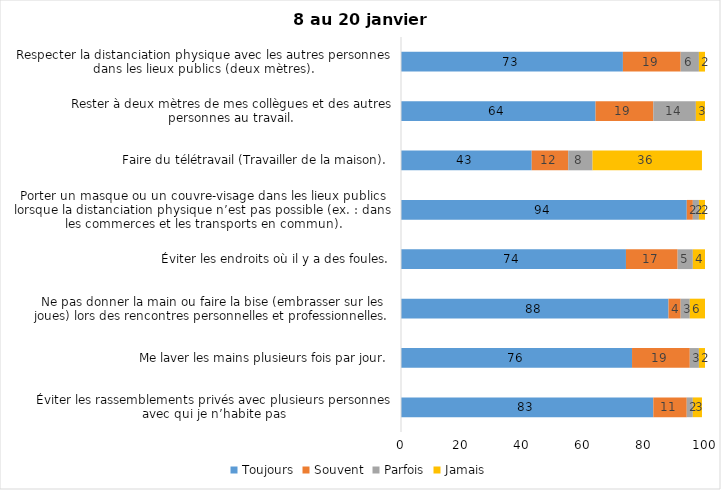
| Category | Toujours | Souvent | Parfois | Jamais |
|---|---|---|---|---|
| Éviter les rassemblements privés avec plusieurs personnes avec qui je n’habite pas | 83 | 11 | 2 | 3 |
| Me laver les mains plusieurs fois par jour. | 76 | 19 | 3 | 2 |
| Ne pas donner la main ou faire la bise (embrasser sur les joues) lors des rencontres personnelles et professionnelles. | 88 | 4 | 3 | 6 |
| Éviter les endroits où il y a des foules. | 74 | 17 | 5 | 4 |
| Porter un masque ou un couvre-visage dans les lieux publics lorsque la distanciation physique n’est pas possible (ex. : dans les commerces et les transports en commun). | 94 | 2 | 2 | 2 |
| Faire du télétravail (Travailler de la maison). | 43 | 12 | 8 | 36 |
| Rester à deux mètres de mes collègues et des autres personnes au travail. | 64 | 19 | 14 | 3 |
| Respecter la distanciation physique avec les autres personnes dans les lieux publics (deux mètres). | 73 | 19 | 6 | 2 |